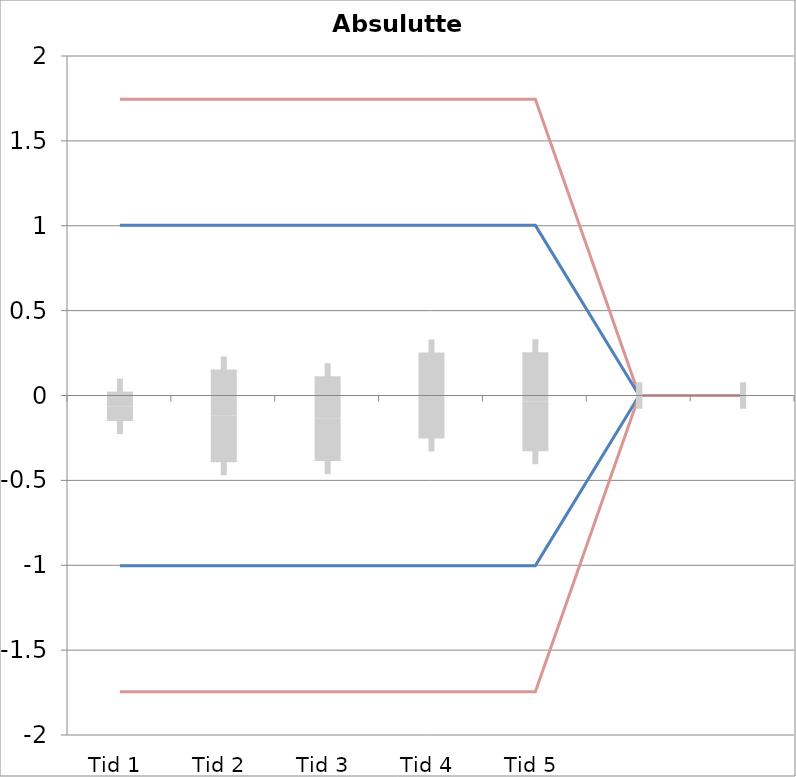
| Category | 1 | 2 | 3 | 4 | 5 | 6 | 7 | 8 | 9 | 10 | 11 | 12 | 13 | 14 | 15 | 16 | 17 | 18 | 19 | 20 | TEa | B | -B | -TEa | M |
|---|---|---|---|---|---|---|---|---|---|---|---|---|---|---|---|---|---|---|---|---|---|---|---|---|---|
| Tid 1 | -0.2 | 0.2 | -0.2 | -0.1 | -0.1 | 0 | -0.2 | 0 | -0.1 | 0.1 | -0.1 | 0 | 0 | 0 | 0 | 0 | 0 | 0 | 0 | 0 | 1.745 | 1.002 | -1.002 | -1.745 | -0.064 |
| Tid 2 | -0.9 | 0.2 | -0.2 | 0 | -0.4 | 0 | -0.2 | 0.1 | -0.4 | 0.4 | 0.2 | 0 | 0 | 0 | 0 | 0 | 0 | 0 | 0 | 0 | 1.745 | 1.002 | -1.002 | -1.745 | -0.12 |
| Tid 3 | -0.6 | 0 | -0.2 | 0 | -0.1 | 0 | 0 | -0.1 | 0.1 | 0.4 | -1 | 0 | 0 | 0 | 0 | 0 | 0 | 0 | 0 | 0 | 1.745 | 1.002 | -1.002 | -1.745 | -0.136 |
| Tid 4 | -0.9 | 0 | 0 | -0.1 | -0.1 | 0.2 | -0.2 | 0 | 0.1 | 0.5 | 0.5 | 0 | 0 | 0 | 0 | 0 | 0 | 0 | 0 | 0 | 1.745 | 1.002 | -1.002 | -1.745 | 0 |
| Tid 5 | 0.4 | 0 | -0.2 | -0.2 | 0 | 0.4 | 0.1 | 0.1 | 0 | 0.2 | -1.2 | 0 | 0 | 0 | 0 | 0 | 0 | 0 | 0 | 0 | 1.745 | 1.002 | -1.002 | -1.745 | -0.036 |